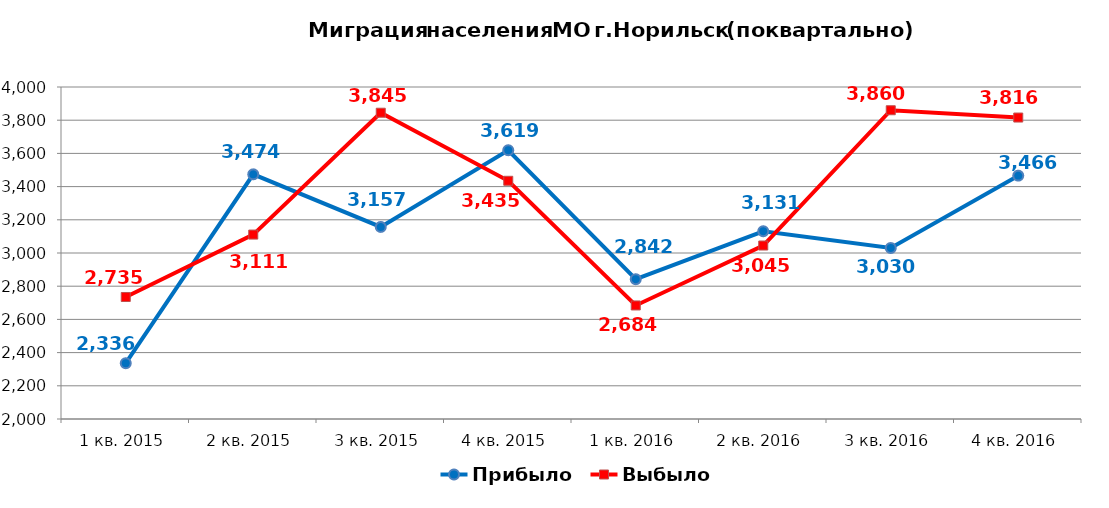
| Category | Прибыло | Выбыло |
|---|---|---|
| 1 кв. 2015 | 2336 | 2735 |
| 2 кв. 2015 | 3474 | 3111 |
| 3 кв. 2015 | 3157 | 3845 |
| 4 кв. 2015 | 3619 | 3435 |
| 1 кв. 2016 | 2842 | 2684 |
| 2 кв. 2016 | 3131 | 3045 |
| 3 кв. 2016 | 3030 | 3860 |
| 4 кв. 2016 | 3466 | 3816 |